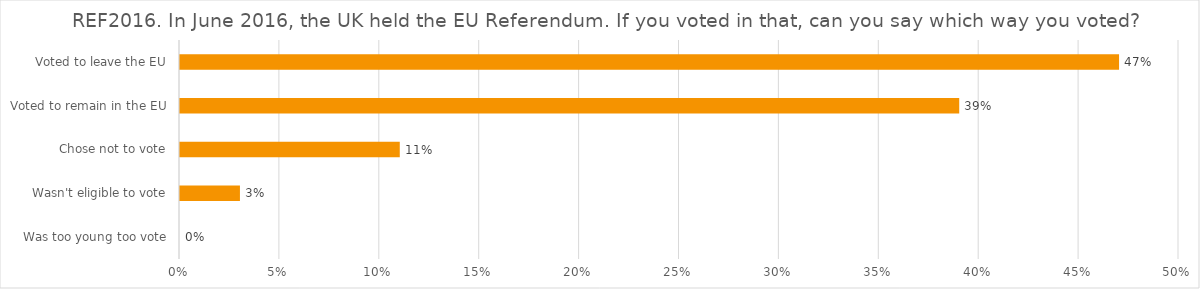
| Category | REF2016. In June 2016, the UK held the EU Referendum. If you voted in that, can you say which way you voted? |
|---|---|
| Was too young too vote | 0 |
| Wasn't eligible to vote | 0.03 |
| Chose not to vote | 0.11 |
| Voted to remain in the EU | 0.39 |
| Voted to leave the EU | 0.47 |